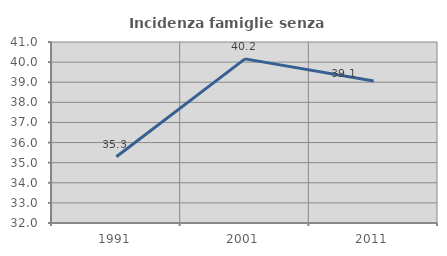
| Category | Incidenza famiglie senza nuclei |
|---|---|
| 1991.0 | 35.294 |
| 2001.0 | 40.161 |
| 2011.0 | 39.062 |